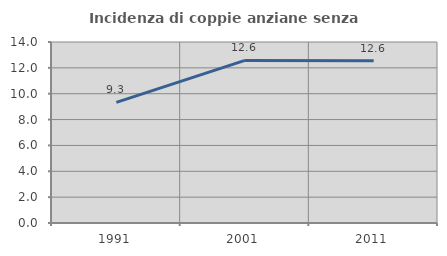
| Category | Incidenza di coppie anziane senza figli  |
|---|---|
| 1991.0 | 9.332 |
| 2001.0 | 12.578 |
| 2011.0 | 12.554 |